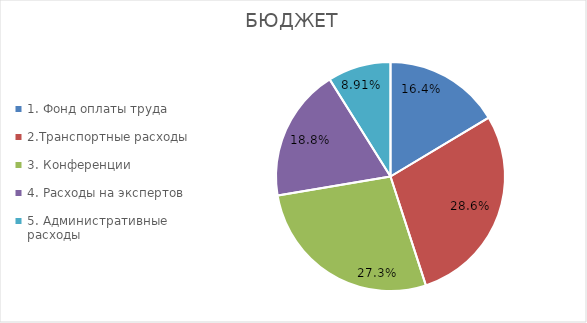
| Category | БЮДЖЕТ |
|---|---|
| 1. Фонд оплаты труда | 0.164 |
| 2.Транспортные расходы | 0.286 |
| 3. Конференции | 0.273 |
| 4. Расходы на экспертов | 0.188 |
| 5. Административные расходы | 0.089 |